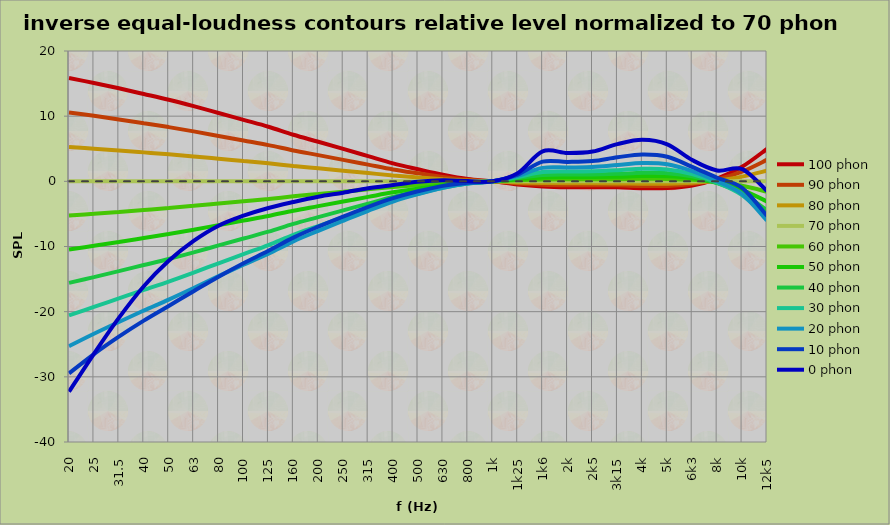
| Category | 100 phon | 90 phon | 80 phon | 70 phon | 60 phon | 50 phon | 40 phon | 30 phon | 20 phon | 10 phon | 0 phon |
|---|---|---|---|---|---|---|---|---|---|---|---|
| 20 | 15.847 | 10.556 | 5.271 | 0 | -5.248 | -10.455 | -15.587 | -20.578 | -25.3 | -29.466 | -32.288 |
| 25 | 15.094 | 10.049 | 5.015 | 0 | -4.979 | -9.895 | -14.692 | -19.266 | -23.391 | -26.503 | -26.467 |
| 31,5 | 14.273 | 9.498 | 4.737 | 0 | -4.694 | -9.309 | -13.778 | -17.968 | -21.584 | -23.83 | -20.96 |
| 40 | 13.401 | 8.915 | 4.444 | 0 | -4.395 | -8.702 | -12.844 | -16.667 | -19.83 | -21.37 | -16.096 |
| 50 | 12.515 | 8.323 | 4.147 | 0 | -4.094 | -8.093 | -11.913 | -15.389 | -18.145 | -19.117 | -12.192 |
| 63 | 11.532 | 7.667 | 3.818 | 0 | -3.763 | -7.425 | -10.9 | -14.013 | -16.37 | -16.857 | -9.135 |
| 80 | 10.486 | 6.968 | 3.468 | 0 | -3.411 | -6.719 | -9.834 | -12.577 | -14.549 | -14.627 | -6.804 |
| 100 | 9.429 | 6.263 | 3.116 | 0 | -3.058 | -6.013 | -8.774 | -11.163 | -12.787 | -12.571 | -5.275 |
| 125 | 8.376 | 5.562 | 2.765 | 0 | -2.709 | -5.314 | -7.73 | -9.781 | -11.091 | -10.656 | -4.091 |
| 160 | 7.145 | 4.742 | 2.356 | 0 | -2.302 | -4.506 | -6.529 | -8.21 | -9.203 | -8.634 | -3.175 |
| 200 | 6.07 | 4.027 | 1.999 | 0 | -1.948 | -3.805 | -5.493 | -6.863 | -7.603 | -6.957 | -2.357 |
| 250 | 4.974 | 3.298 | 1.636 | 0 | -1.59 | -3.098 | -4.455 | -5.53 | -6.055 | -5.412 | -1.742 |
| 315 | 3.864 | 2.56 | 1.269 | 0 | -1.229 | -2.387 | -3.416 | -4.204 | -4.532 | -3.916 | -1.062 |
| 400 | 2.751 | 1.822 | 0.902 | 0 | -0.871 | -1.685 | -2.397 | -2.923 | -3.097 | -2.58 | -0.559 |
| 500 | 1.853 | 1.225 | 0.606 | 0 | -0.582 | -1.121 | -1.583 | -1.904 | -1.965 | -1.528 | -0.076 |
| 630 | 1.007 | 0.665 | 0.328 | 0 | -0.313 | -0.6 | -0.839 | -0.992 | -0.988 | -0.695 | 0.154 |
| 800 | 0.343 | 0.226 | 0.112 | 0 | -0.106 | -0.203 | -0.283 | -0.332 | -0.327 | -0.225 | 0.054 |
| 1k | 0 | 0 | 0 | 0 | 0 | 0 | 0 | 0 | 0 | 0 | 0 |
| 1k25 | -0.49 | -0.327 | -0.164 | 0 | 0.164 | 0.33 | 0.498 | 0.67 | 0.85 | 1.043 | 1.26 |
| 1k6 | -0.778 | -0.525 | -0.267 | 0 | 0.284 | 0.597 | 0.963 | 1.425 | 2.061 | 3.02 | 4.602 |
| 2k | -0.897 | -0.603 | -0.305 | 0 | 0.319 | 0.662 | 1.049 | 1.513 | 2.119 | 2.984 | 4.34 |
| 2k5 | -0.9 | -0.606 | -0.307 | 0 | 0.322 | 0.67 | 1.066 | 1.547 | 2.182 | 3.103 | 4.569 |
| 3k15 | -0.914 | -0.618 | -0.315 | 0 | 0.336 | 0.709 | 1.148 | 1.709 | 2.492 | 3.692 | 5.717 |
| 4k | -1.046 | -0.706 | -0.36 | 0 | 0.382 | 0.805 | 1.301 | 1.928 | 2.799 | 4.128 | 6.373 |
| 5k | -1.038 | -0.699 | -0.355 | 0 | 0.374 | 0.783 | 1.252 | 1.833 | 2.616 | 3.778 | 5.68 |
| 6k3 | -0.638 | -0.43 | -0.218 | 0 | 0.229 | 0.477 | 0.76 | 1.105 | 1.561 | 2.222 | 3.263 |
| 8k | 0.434 | 0.283 | 0.137 | 0 | -0.121 | -0.214 | -0.256 | -0.206 | 0.012 | 0.539 | 1.664 |
| 10k | 2.237 | 1.477 | 0.728 | 0 | -0.691 | -1.316 | -1.821 | -2.106 | -1.971 | -0.995 | 1.885 |
| 12k5 | 4.972 | 3.296 | 1.635 | 0 | -1.589 | -3.093 | -4.444 | -5.507 | -6.009 | -5.315 | -1.488 |